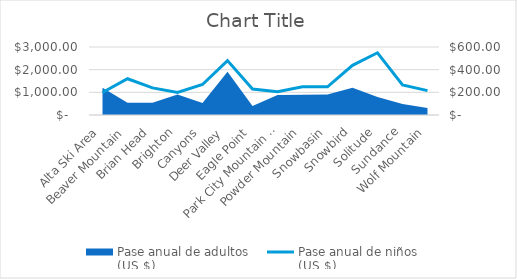
| Category | Pase anual de niños
(US $) |
|---|---|
| Alta Ski Area | 199 |
| Beaver Mountain | 320 |
| Brian Head | 239 |
| Brighton | 199 |
| Canyons | 269 |
| Deer Valley | 480 |
| Eagle Point | 229 |
| Park City Mountain Resort | 205 |
| Powder Mountain | 250 |
| Snowbasin | 249 |
| Snowbird | 438 |
| Solitude | 549 |
| Sundance | 265 |
| Wolf Mountain | 215 |